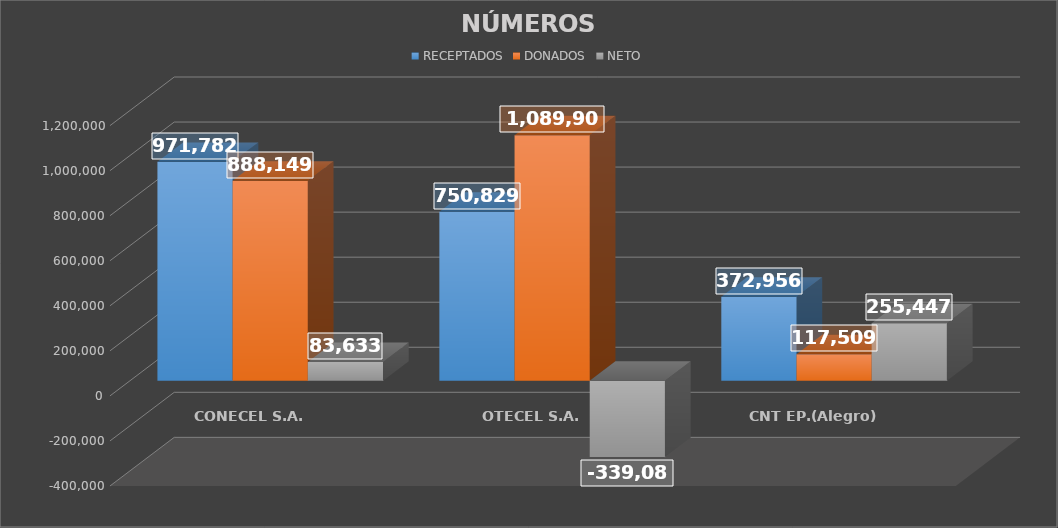
| Category | RECEPTADOS | DONADOS | NETO |
|---|---|---|---|
| CONECEL S.A. | 971782 | 888149 | 83633 |
| OTECEL S.A. | 750829 | 1089909 | -339080 |
| CNT EP.(Alegro) | 372956 | 117509 | 255447 |